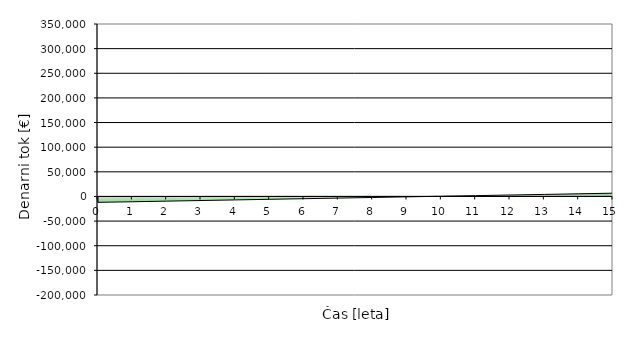
| Category | Series 0 |
|---|---|
| 0.0 | -12000 |
| 1.0 | -10757.433 |
| 2.0 | -9514.867 |
| 3.0 | -8272.3 |
| 4.0 | -7029.734 |
| 5.0 | -5787.167 |
| 6.0 | -4544.601 |
| 7.0 | -3302.034 |
| 8.0 | -2059.468 |
| 9.0 | -816.901 |
| 10.0 | 425.665 |
| 11.0 | 1668.232 |
| 12.0 | 2910.798 |
| 13.0 | 4153.365 |
| 14.0 | 5395.931 |
| 15.0 | 6638.498 |